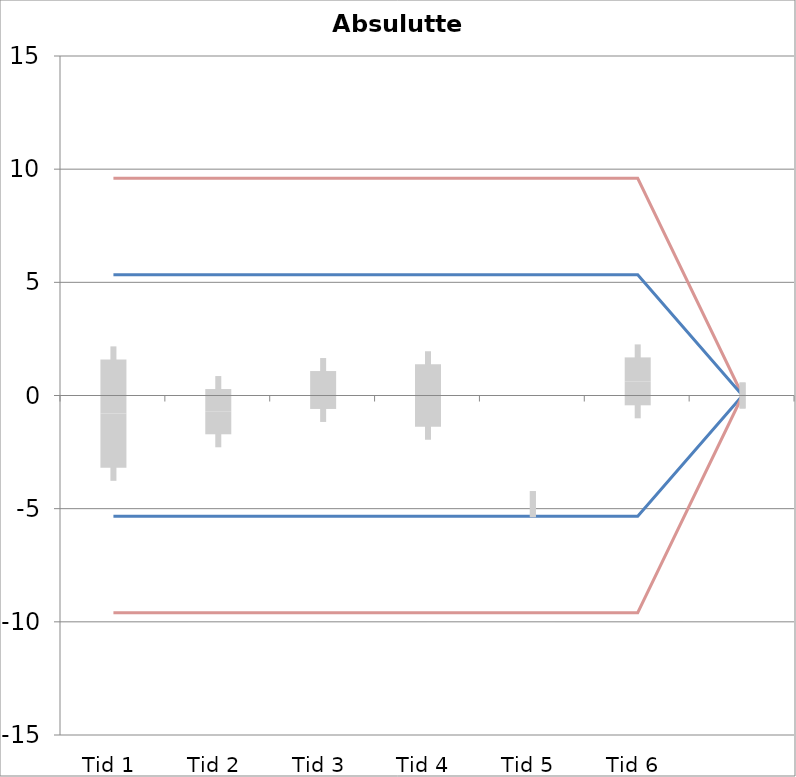
| Category | 1 | 2 | 3 | 4 | 5 | 6 | 7 | 8 | 9 | 10 | 11 | 12 | 13 | 14 | 15 | 16 | 17 | 18 | 19 | 20 | TEa | B | -B | -TEa | M |
|---|---|---|---|---|---|---|---|---|---|---|---|---|---|---|---|---|---|---|---|---|---|---|---|---|---|
| Tid 1 | -0.3 | -5.8 | -2.4 | -0.1 | 1.8 | 1.4 | -0.2 | 0 | 0 | 0 | 0 | 0 | 0 | 0 | 0 | 0 | 0 | 0 | 0 | 0 | 9.6 | 5.339 | -5.339 | -9.6 | -0.8 |
| Tid 2 | -0.4 | -2.4 | -2.1 | -0.1 | 0.4 | -0.2 | -0.2 | 0 | 0 | 0 | 0 | 0 | 0 | 0 | 0 | 0 | 0 | 0 | 0 | 0 | 9.6 | 5.339 | -5.339 | -9.6 | -0.714 |
| Tid 3 | 0.5 | -0.6 | -0.5 | 0.1 | 0.2 | 2.1 | -0.1 | 0 | 0 | 0 | 0 | 0 | 0 | 0 | 0 | 0 | 0 | 0 | 0 | 0 | 9.6 | 5.339 | -5.339 | -9.6 | 0.243 |
| Tid 4 | -0.1 | -2.1 | -1.4 | -0.1 | 2.1 | 1.6 | 0 | 0 | 0 | 0 | 0 | 0 | 0 | 0 | 0 | 0 | 0 | 0 | 0 | 0 | 9.6 | 5.339 | -5.339 | -9.6 | 0 |
| Tid 5 | 0 | 0 | 0 | 0 | -4.8 | 0 | 0 | 0 | 0 | 0 | 0 | 0 | 0 | 0 | 0 | 0 | 0 | 0 | 0 | 0 | 9.6 | 5.339 | -5.339 | -9.6 | -4.8 |
| Tid 6 | 0 | 0 | 0 | 0.1 | 1.2 | 1.2 | 0 | 0 | 0 | 0 | 0 | 0 | 0 | 0 | 0 | 0 | 0 | 0 | 0 | 0 | 9.6 | 5.339 | -5.339 | -9.6 | 0.625 |